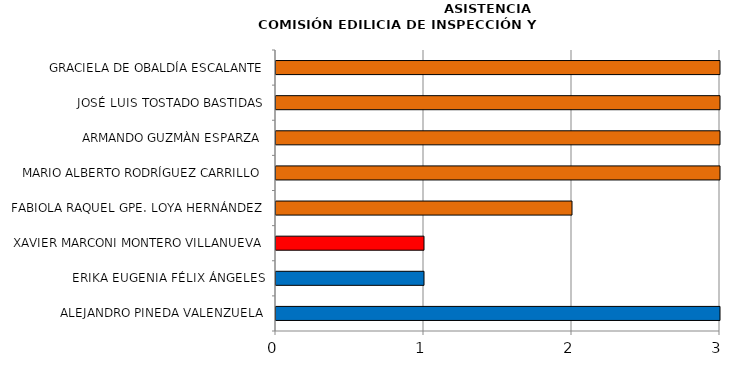
| Category | Series 0 |
|---|---|
| ALEJANDRO PINEDA VALENZUELA | 3 |
| ERIKA EUGENIA FÉLIX ÁNGELES | 1 |
| XAVIER MARCONI MONTERO VILLANUEVA | 1 |
| FABIOLA RAQUEL GPE. LOYA HERNÁNDEZ | 2 |
| MARIO ALBERTO RODRÍGUEZ CARRILLO | 3 |
| ARMANDO GUZMÀN ESPARZA | 3 |
| JOSÉ LUIS TOSTADO BASTIDAS | 3 |
| GRACIELA DE OBALDÍA ESCALANTE | 3 |